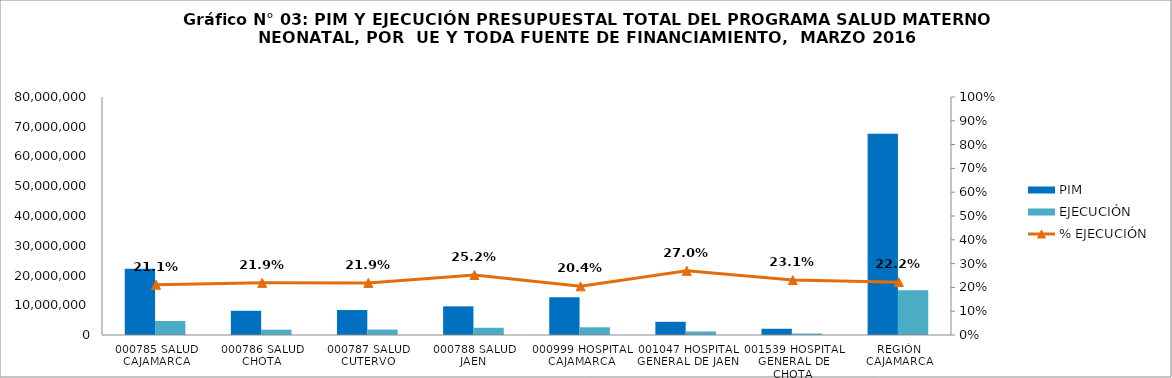
| Category | PIM  | EJECUCIÓN  |
|---|---|---|
| 000785 SALUD CAJAMARCA | 22285143 | 4705797 |
| 000786 SALUD CHOTA | 8142910 | 1784161 |
| 000787 SALUD CUTERVO | 8384633 | 1834894 |
| 000788 SALUD JAEN | 9628005 | 2429480 |
| 000999 HOSPITAL CAJAMARCA | 12691098 | 2594048 |
| 001047 HOSPITAL GENERAL DE JAEN | 4438118 | 1196580 |
| 001539 HOSPITAL GENERAL DE CHOTA | 2097109 | 483683 |
| REGIÓN CAJAMARCA | 67667016 | 15028643 |